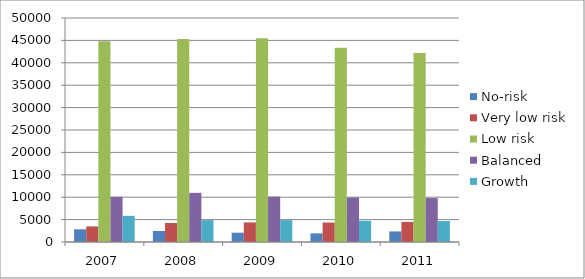
| Category | No-risk | Very low risk | Low risk | Balanced | Growth |
|---|---|---|---|---|---|
| 2007.0 | 2832 | 3474 | 44830 | 10092 | 5842 |
| 2008.0 | 2459 | 4247 | 45337 | 10974 | 4885 |
| 2009.0 | 2079 | 4372 | 45478 | 10140 | 4880 |
| 2010.0 | 1929 | 4347 | 43367 | 9938 | 4742 |
| 2011.0 | 2365 | 4489 | 42162 | 9806 | 4684 |